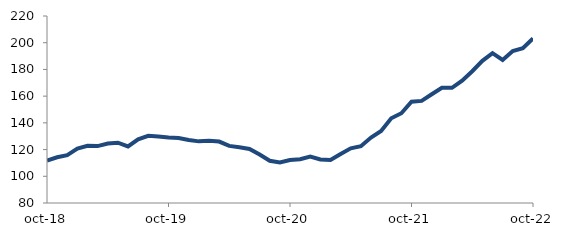
| Category | Series 0 |
|---|---|
| 2018-10-01 | 111.815 |
| 2018-11-01 | 114.242 |
| 2018-12-01 | 115.778 |
| 2019-01-01 | 120.689 |
| 2019-02-01 | 122.792 |
| 2019-03-01 | 122.605 |
| 2019-04-01 | 124.541 |
| 2019-05-01 | 125.115 |
| 2019-06-01 | 122.365 |
| 2019-07-01 | 127.653 |
| 2019-08-01 | 130.323 |
| 2019-09-01 | 129.814 |
| 2019-10-01 | 129.013 |
| 2019-11-01 | 128.663 |
| 2019-12-01 | 127.192 |
| 2020-01-01 | 126.144 |
| 2020-02-01 | 126.638 |
| 2020-03-01 | 125.992 |
| 2020-04-01 | 122.726 |
| 2020-05-01 | 121.669 |
| 2020-06-01 | 120.485 |
| 2020-07-01 | 116.268 |
| 2020-08-01 | 111.597 |
| 2020-09-01 | 110.39 |
| 2020-10-01 | 112.229 |
| 2020-11-01 | 112.769 |
| 2020-12-01 | 114.741 |
| 2021-01-01 | 112.625 |
| 2021-02-01 | 112.14 |
| 2021-03-01 | 116.74 |
| 2021-04-01 | 120.911 |
| 2021-05-01 | 122.536 |
| 2021-06-01 | 128.968 |
| 2021-07-01 | 133.864 |
| 2021-08-01 | 143.384 |
| 2021-09-01 | 147.196 |
| 2021-10-01 | 155.883 |
| 2021-11-01 | 156.426 |
| 2021-12-01 | 161.4 |
| 2022-01-01 | 166.276 |
| 2022-02-01 | 166.219 |
| 2022-03-01 | 171.531 |
| 2022-04-01 | 178.644 |
| 2022-05-01 | 186.465 |
| 2022-06-01 | 192.187 |
| 2022-07-01 | 187.044 |
| 2022-08-01 | 193.806 |
| 2022-09-01 | 195.846 |
| 2022-10-01 | 203.287 |